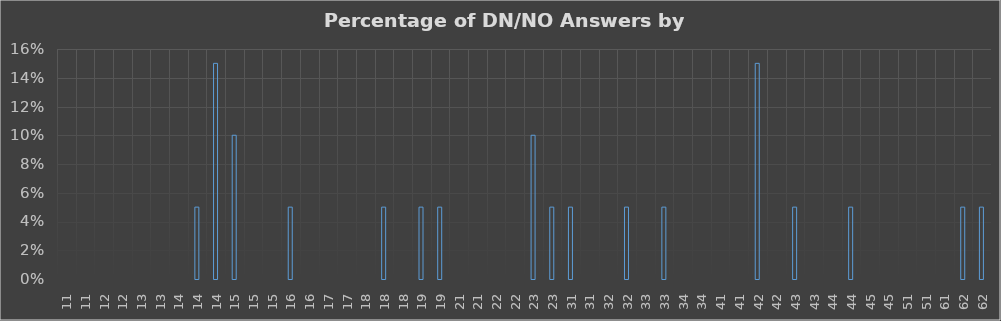
| Category | Series 0 |
|---|---|
| 11 | 0 |
| 11 | 0 |
| 12 | 0 |
| 12 | 0 |
| 13 | 0 |
| 13 | 0 |
| 14 | 0 |
| 14 | 0.05 |
| 14 | 0.15 |
| 15 | 0.1 |
| 15 | 0 |
| 15 | 0 |
| 16 | 0.05 |
| 16 | 0 |
| 17 | 0 |
| 17 | 0 |
| 18 | 0 |
| 18 | 0.05 |
| 18 | 0 |
| 19 | 0.05 |
| 19 | 0.05 |
| 21 | 0 |
| 21 | 0 |
| 22 | 0 |
| 22 | 0 |
| 23 | 0.1 |
| 23 | 0.05 |
| 31 | 0.05 |
| 31 | 0 |
| 32 | 0 |
| 32 | 0.05 |
| 33 | 0 |
| 33 | 0.05 |
| 34 | 0 |
| 34 | 0 |
| 41 | 0 |
| 41 | 0 |
| 42 | 0.15 |
| 42 | 0 |
| 43 | 0.05 |
| 43 | 0 |
| 44 | 0 |
| 44 | 0.05 |
| 45 | 0 |
| 45 | 0 |
| 51 | 0 |
| 51 | 0 |
| 61 | 0 |
| 62 | 0.05 |
| 62 | 0.05 |